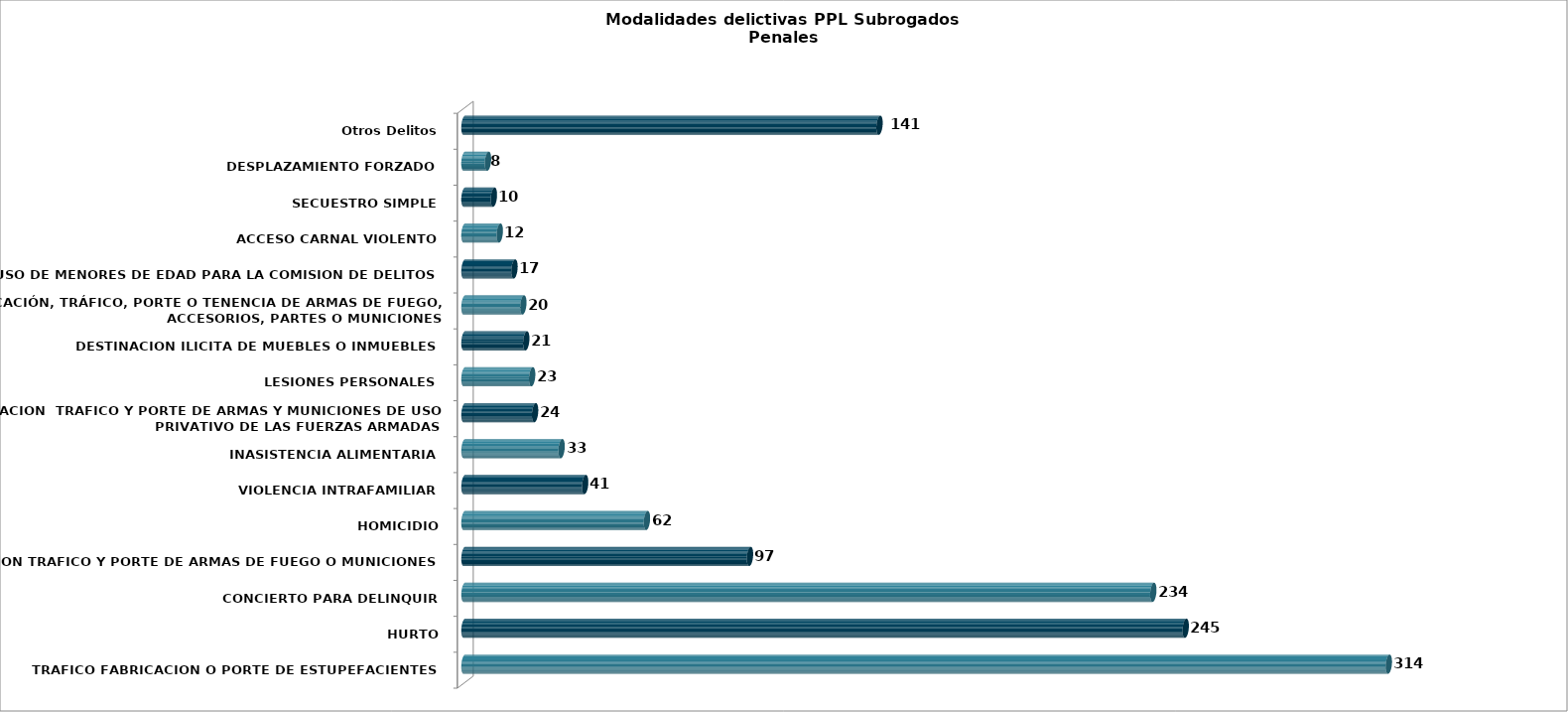
| Category | Series 0 |
|---|---|
| TRAFICO FABRICACION O PORTE DE ESTUPEFACIENTES | 314 |
| HURTO | 245 |
| CONCIERTO PARA DELINQUIR | 234 |
| FABRICACION TRAFICO Y PORTE DE ARMAS DE FUEGO O MUNICIONES | 97 |
| HOMICIDIO | 62 |
| VIOLENCIA INTRAFAMILIAR | 41 |
| INASISTENCIA ALIMENTARIA | 33 |
| FABRICACION  TRAFICO Y PORTE DE ARMAS Y MUNICIONES DE USO PRIVATIVO DE LAS FUERZAS ARMADAS | 24 |
| LESIONES PERSONALES | 23 |
| DESTINACION ILICITA DE MUEBLES O INMUEBLES | 21 |
| FABRICACIÓN, TRÁFICO, PORTE O TENENCIA DE ARMAS DE FUEGO, ACCESORIOS, PARTES O MUNICIONES | 20 |
| USO DE MENORES DE EDAD PARA LA COMISION DE DELITOS | 17 |
| ACCESO CARNAL VIOLENTO | 12 |
| SECUESTRO SIMPLE | 10 |
| DESPLAZAMIENTO FORZADO | 8 |
| Otros Delitos | 141 |